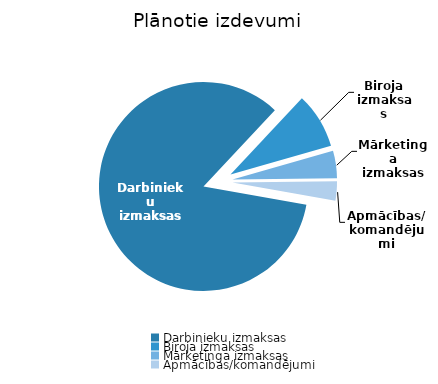
| Category | Series 0 |
|---|---|
| Darbinieku izmaksas | 1355090 |
| Biroja izmaksas | 138740 |
| Mārketinga izmaksas | 67800 |
| Apmācības/komandējumi | 48000 |